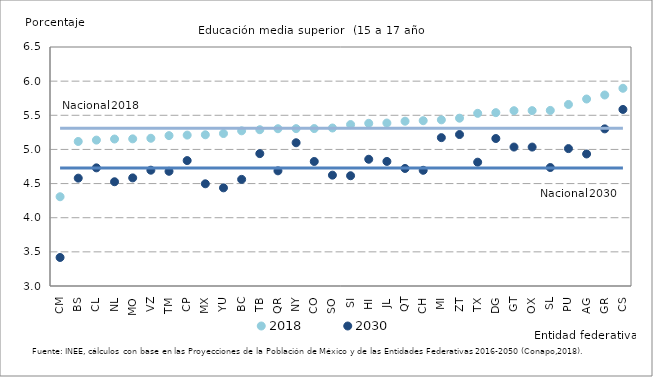
| Category | 2018 | 2030 | N_18 | N_30 |
|---|---|---|---|---|
| CM | 4.307 | 3.418 | 5.312 | 4.728 |
| BS | 5.116 | 4.579 | 5.312 | 4.728 |
| CL | 5.137 | 4.73 | 5.312 | 4.728 |
| NL | 5.152 | 4.527 | 5.312 | 4.728 |
| MO | 5.155 | 4.583 | 5.312 | 4.728 |
| VZ | 5.164 | 4.696 | 5.312 | 4.728 |
| TM | 5.202 | 4.68 | 5.312 | 4.728 |
| CP | 5.21 | 4.837 | 5.312 | 4.728 |
| MX | 5.215 | 4.497 | 5.312 | 4.728 |
| YU | 5.233 | 4.437 | 5.312 | 4.728 |
| BC | 5.273 | 4.561 | 5.312 | 4.728 |
| TB | 5.289 | 4.938 | 5.312 | 4.728 |
| QR | 5.303 | 4.686 | 5.312 | 4.728 |
| NY | 5.304 | 5.098 | 5.312 | 4.728 |
| CO | 5.305 | 4.824 | 5.312 | 4.728 |
| SO | 5.314 | 4.623 | 5.312 | 4.728 |
| SI | 5.364 | 4.615 | 5.312 | 4.728 |
| HI | 5.382 | 4.856 | 5.312 | 4.728 |
| JL | 5.386 | 4.824 | 5.312 | 4.728 |
| QT | 5.413 | 4.721 | 5.312 | 4.728 |
| CH | 5.421 | 4.694 | 5.312 | 4.728 |
| MI | 5.433 | 5.173 | 5.312 | 4.728 |
| ZT | 5.457 | 5.218 | 5.312 | 4.728 |
| TX | 5.529 | 4.813 | 5.312 | 4.728 |
| DG | 5.539 | 5.16 | 5.312 | 4.728 |
| GT | 5.567 | 5.035 | 5.312 | 4.728 |
| OX | 5.568 | 5.034 | 5.312 | 4.728 |
| SL | 5.571 | 4.735 | 5.312 | 4.728 |
| PU | 5.658 | 5.012 | 5.312 | 4.728 |
| AG | 5.738 | 4.934 | 5.312 | 4.728 |
| GR | 5.797 | 5.301 | 5.312 | 4.728 |
| CS | 5.896 | 5.586 | 5.312 | 4.728 |